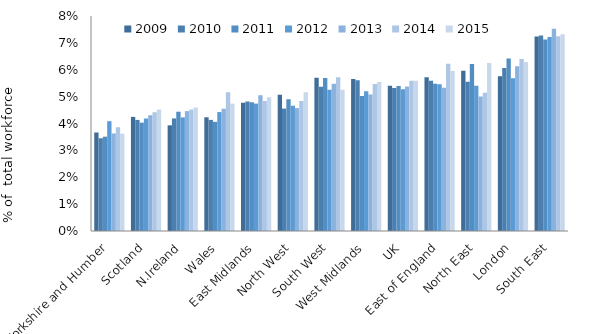
| Category | 2009 | 2010 | 2011 | 2012 | 2013 | 2014 | 2015 |
|---|---|---|---|---|---|---|---|
| Yorkshire and Humber | 0.037 | 0.035 | 0.035 | 0.041 | 0.036 | 0.039 | 0.036 |
| Scotland | 0.042 | 0.041 | 0.04 | 0.042 | 0.043 | 0.044 | 0.045 |
| N.Ireland | 0.039 | 0.042 | 0.044 | 0.042 | 0.045 | 0.045 | 0.046 |
| Wales | 0.042 | 0.041 | 0.041 | 0.044 | 0.045 | 0.052 | 0.047 |
| East Midlands | 0.048 | 0.048 | 0.048 | 0.047 | 0.051 | 0.048 | 0.05 |
| North West | 0.051 | 0.046 | 0.049 | 0.047 | 0.046 | 0.048 | 0.052 |
| South West | 0.057 | 0.054 | 0.057 | 0.053 | 0.055 | 0.057 | 0.053 |
| West Midlands | 0.057 | 0.056 | 0.05 | 0.052 | 0.051 | 0.055 | 0.055 |
| UK | 0.054 | 0.053 | 0.054 | 0.053 | 0.054 | 0.056 | 0.056 |
| East of England | 0.057 | 0.056 | 0.055 | 0.055 | 0.053 | 0.062 | 0.06 |
| North East | 0.06 | 0.056 | 0.062 | 0.054 | 0.05 | 0.051 | 0.063 |
| London | 0.058 | 0.061 | 0.064 | 0.057 | 0.061 | 0.064 | 0.063 |
| South East | 0.072 | 0.073 | 0.071 | 0.072 | 0.075 | 0.072 | 0.073 |